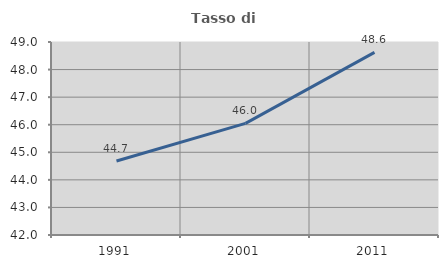
| Category | Tasso di occupazione   |
|---|---|
| 1991.0 | 44.684 |
| 2001.0 | 46.05 |
| 2011.0 | 48.625 |